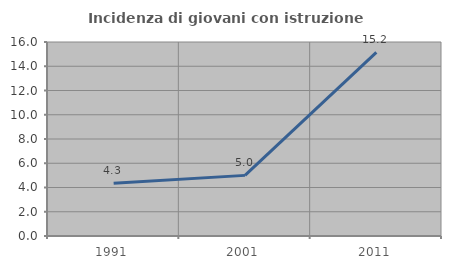
| Category | Incidenza di giovani con istruzione universitaria |
|---|---|
| 1991.0 | 4.348 |
| 2001.0 | 5 |
| 2011.0 | 15.152 |